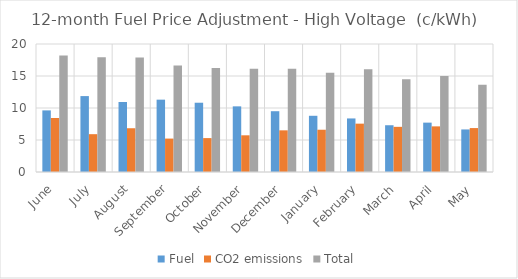
| Category | Fuel | CO2 emissions | Total |
|---|---|---|---|
| June | 9.626 | 8.44 | 18.192 |
| July | 11.861 | 5.91 | 17.936 |
| August | 10.941 | 6.838 | 17.904 |
| September | 11.303 | 5.221 | 16.658 |
| October | 10.824 | 5.298 | 16.264 |
| November | 10.257 | 5.733 | 16.114 |
| December | 9.498 | 6.51 | 16.126 |
| January | 8.784 | 6.604 | 15.526 |
| February | 8.369 | 7.554 | 16.054 |
| March | 7.307 | 7.056 | 14.476 |
| April | 7.714 | 7.13 | 15.001 |
| May | 6.649 | 6.864 | 13.63 |